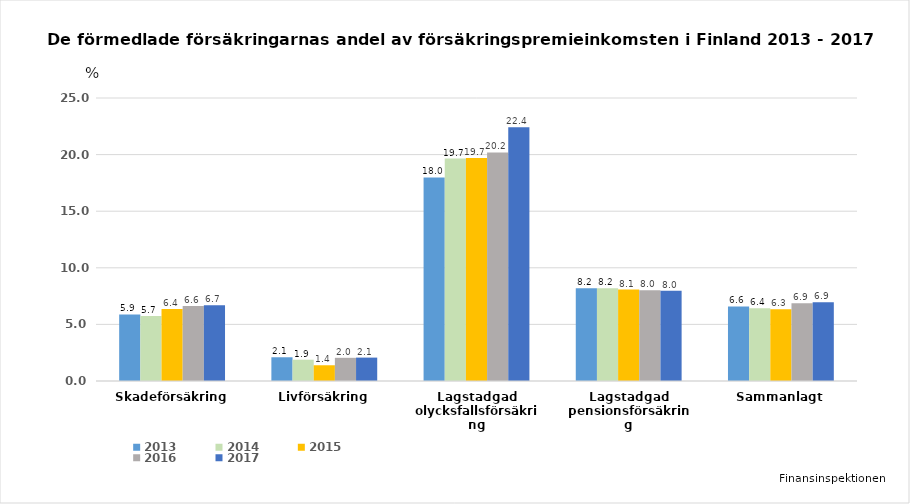
| Category | 2013 | 2014 | 2015 | 2016 | 2017 |
|---|---|---|---|---|---|
| Skadeförsäkring | 5.882 | 5.737 | 6.356 | 6.621 | 6.681 |
| Livförsäkring | 2.097 | 1.88 | 1.39 | 2.047 | 2.067 |
| Lagstadgad olycksfallsförsäkring | 17.98 | 19.654 | 19.692 | 20.194 | 22.408 |
| Lagstadgad pensionsförsäkring | 8.204 | 8.203 | 8.075 | 8.016 | 7.982 |
| Sammanlagt | 6.584 | 6.436 | 6.337 | 6.875 | 6.948 |